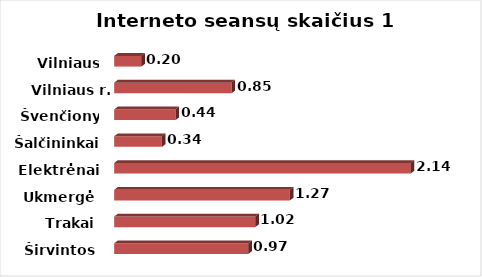
| Category | Series 0 |
|---|---|
| Širvintos | 0.967 |
| Trakai | 1.017 |
| Ukmergė | 1.267 |
| Elektrėnai | 2.137 |
| Šalčininkai | 0.344 |
| Švenčionys | 0.442 |
| Vilniaus r. | 0.845 |
| Vilniaus m. | 0.196 |